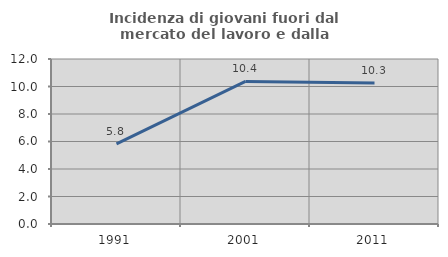
| Category | Incidenza di giovani fuori dal mercato del lavoro e dalla formazione  |
|---|---|
| 1991.0 | 5.825 |
| 2001.0 | 10.37 |
| 2011.0 | 10.251 |